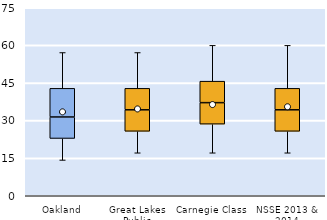
| Category | 25th | 50th | 75th |
|---|---|---|---|
| Oakland | 22.857 | 8.571 | 11.429 |
| Great Lakes Public | 25.714 | 8.571 | 8.571 |
| Carnegie Class | 28.571 | 8.571 | 8.571 |
| NSSE 2013 & 2014 | 25.714 | 8.571 | 8.571 |